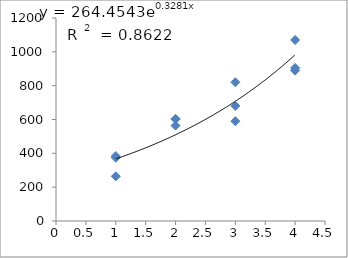
| Category | Series 0 |
|---|---|
| 1.0 | 374 |
| 1.0 | 264 |
| 1.0 | 384 |
| 2.0 | 604 |
| 2.0 | 602 |
| 2.0 | 564 |
| 3.0 | 680 |
| 3.0 | 590 |
| 3.0 | 820 |
| 4.0 | 1070 |
| 4.0 | 905 |
| 4.0 | 890 |